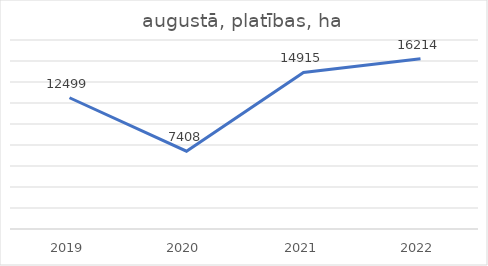
| Category | augustā, platības, ha |
|---|---|
| 2019.0 | 12499 |
| 2020.0 | 7408 |
| 2021.0 | 14915 |
| 2022.0 | 16214 |